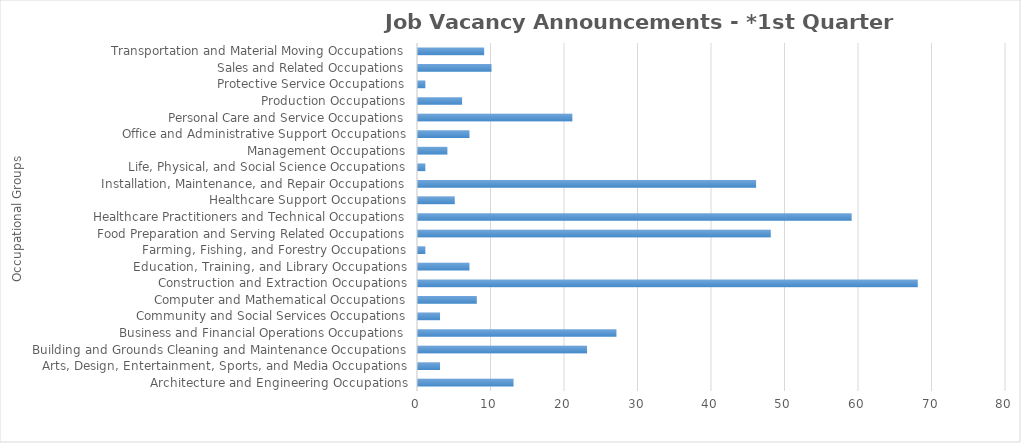
| Category | Total JVAs |
|---|---|
| Architecture and Engineering Occupations | 13 |
| Arts, Design, Entertainment, Sports, and Media Occupations | 3 |
| Building and Grounds Cleaning and Maintenance Occupations | 23 |
| Business and Financial Operations Occupations | 27 |
| Community and Social Services Occupations | 3 |
| Computer and Mathematical Occupations | 8 |
| Construction and Extraction Occupations | 68 |
| Education, Training, and Library Occupations | 7 |
| Farming, Fishing, and Forestry Occupations | 1 |
| Food Preparation and Serving Related Occupations | 48 |
| Healthcare Practitioners and Technical Occupations | 59 |
| Healthcare Support Occupations | 5 |
| Installation, Maintenance, and Repair Occupations | 46 |
| Life, Physical, and Social Science Occupations | 1 |
| Management Occupations | 4 |
| Office and Administrative Support Occupations | 7 |
| Personal Care and Service Occupations | 21 |
| Production Occupations | 6 |
| Protective Service Occupations | 1 |
| Sales and Related Occupations | 10 |
| Transportation and Material Moving Occupations | 9 |